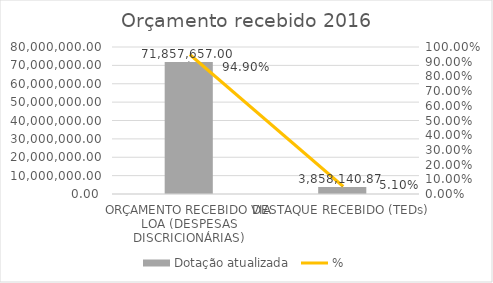
| Category | Dotação atualizada |
|---|---|
| ORÇAMENTO RECEBIDO VIA LOA (DESPESAS DISCRICIONÁRIAS) | 71857657 |
| DESTAQUE RECEBIDO (TEDs) | 3858140.87 |